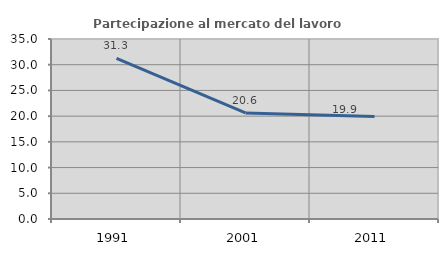
| Category | Partecipazione al mercato del lavoro  femminile |
|---|---|
| 1991.0 | 31.25 |
| 2001.0 | 20.63 |
| 2011.0 | 19.931 |